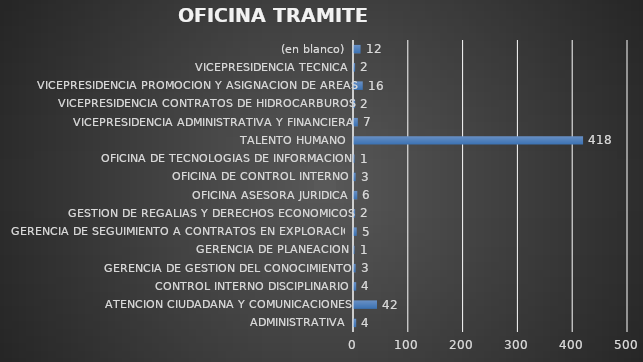
| Category | OFICINA DE TRAMITE FINAL 3º TRIMESTRE DE  2020 |
|---|---|
| ADMINISTRATIVA | 4 |
| ATENCION CIUDADANA Y COMUNICACIONES | 42 |
| CONTROL INTERNO DISCIPLINARIO | 4 |
| GERENCIA DE GESTION DEL CONOCIMIENTO | 3 |
| GERENCIA DE PLANEACION | 1 |
| GERENCIA DE SEGUIMIENTO A CONTRATOS EN EXPLORACION | 5 |
| GESTION DE REGALIAS Y DERECHOS ECONOMICOS | 2 |
| OFICINA ASESORA JURIDICA | 6 |
| OFICINA DE CONTROL INTERNO | 3 |
| OFICINA DE TECNOLOGIAS DE INFORMACION | 1 |
| TALENTO HUMANO | 418 |
| VICEPRESIDENCIA ADMINISTRATIVA Y FINANCIERA | 7 |
| VICEPRESIDENCIA CONTRATOS DE HIDROCARBUROS | 2 |
| VICEPRESIDENCIA PROMOCION Y ASIGNACION DE AREAS | 16 |
| VICEPRESIDENCIA TECNICA | 2 |
| (en blanco) | 12 |